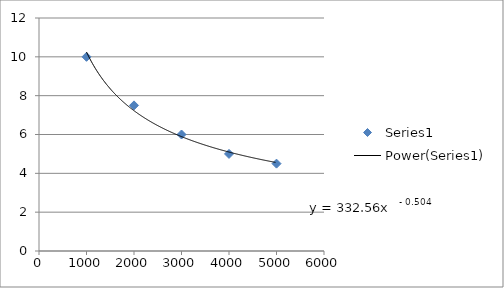
| Category | Series 0 |
|---|---|
| 1000.0 | 10 |
| 2000.0 | 7.5 |
| 3000.0 | 6 |
| 4000.0 | 5 |
| 5000.0 | 4.5 |